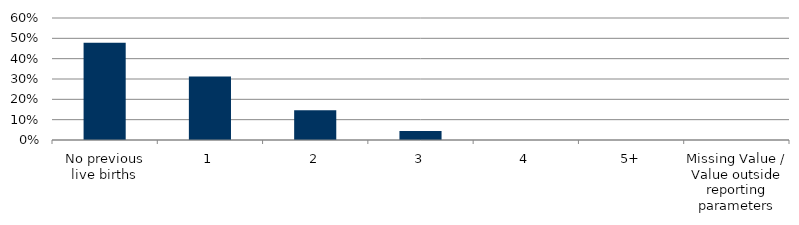
| Category | Total |
|---|---|
| No previous live births | 0.478 |
| 1 | 0.312 |
| 2 | 0.146 |
| 3 | 0.045 |
| 4 | 0 |
| 5+ | 0 |
| Missing Value / Value outside reporting parameters | 0 |